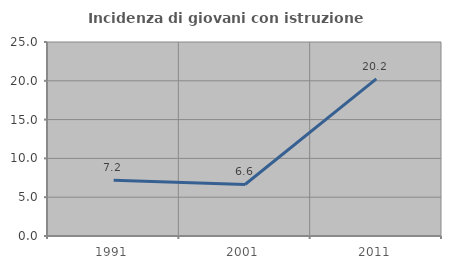
| Category | Incidenza di giovani con istruzione universitaria |
|---|---|
| 1991.0 | 7.179 |
| 2001.0 | 6.637 |
| 2011.0 | 20.245 |